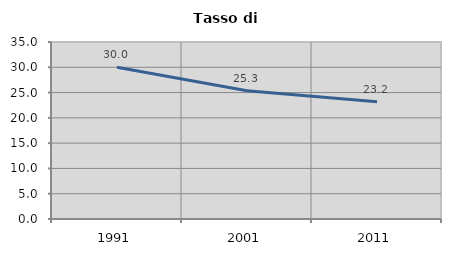
| Category | Tasso di disoccupazione   |
|---|---|
| 1991.0 | 30.012 |
| 2001.0 | 25.343 |
| 2011.0 | 23.18 |